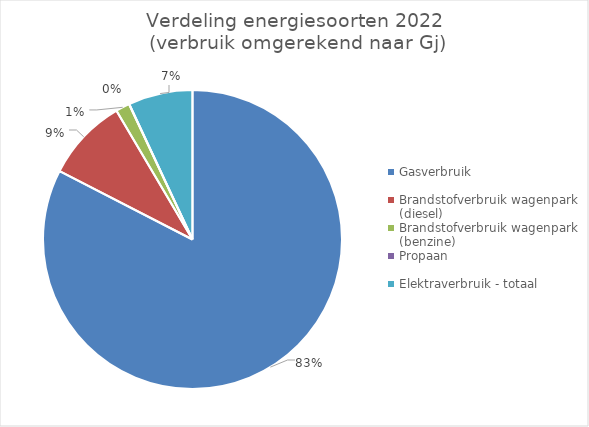
| Category | Series 0 |
|---|---|
| Gasverbruik | 20102.308 |
| Brandstofverbruik wagenpark (diesel) | 2178.148 |
| Brandstofverbruik wagenpark (benzine) | 366.329 |
| Propaan | 6.607 |
| Elektraverbruik - totaal | 1693.254 |